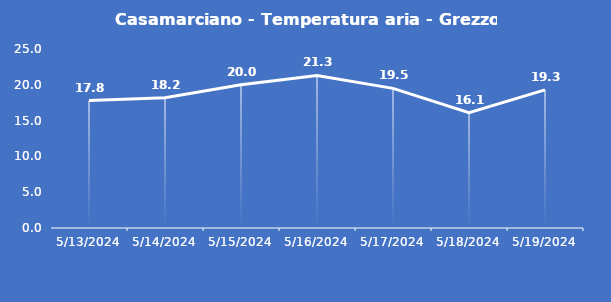
| Category | Casamarciano - Temperatura aria - Grezzo (°C) |
|---|---|
| 5/13/24 | 17.8 |
| 5/14/24 | 18.2 |
| 5/15/24 | 20 |
| 5/16/24 | 21.3 |
| 5/17/24 | 19.5 |
| 5/18/24 | 16.1 |
| 5/19/24 | 19.3 |